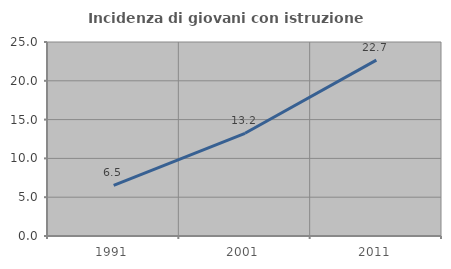
| Category | Incidenza di giovani con istruzione universitaria |
|---|---|
| 1991.0 | 6.513 |
| 2001.0 | 13.235 |
| 2011.0 | 22.664 |